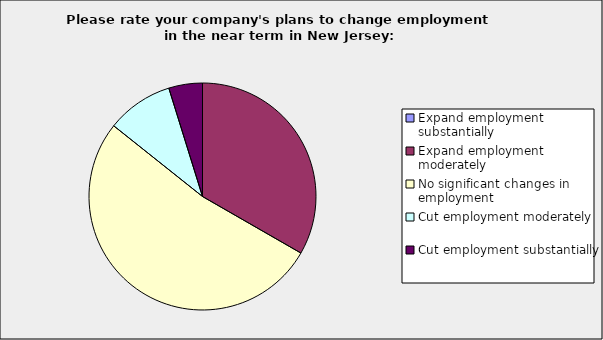
| Category | Series 0 |
|---|---|
| Expand employment substantially | 0 |
| Expand employment moderately | 0.333 |
| No significant changes in employment | 0.524 |
| Cut employment moderately | 0.095 |
| Cut employment substantially | 0.048 |